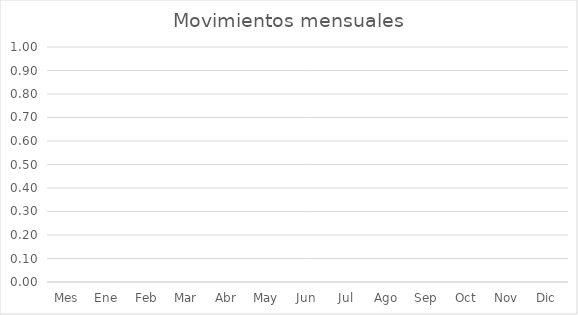
| Category | Series 0 | Series 1 |
|---|---|---|
| Mes | 0 |  |
| Ene | 0 |  |
| Feb | 0 |  |
| Mar | 0 |  |
| Abr | 0 |  |
| May | 0 |  |
| Jun | 0 |  |
| Jul | 0 |  |
| Ago | 0 |  |
| Sep | 0 |  |
| Oct | 0 |  |
| Nov | 0 |  |
| Dic | 0 |  |